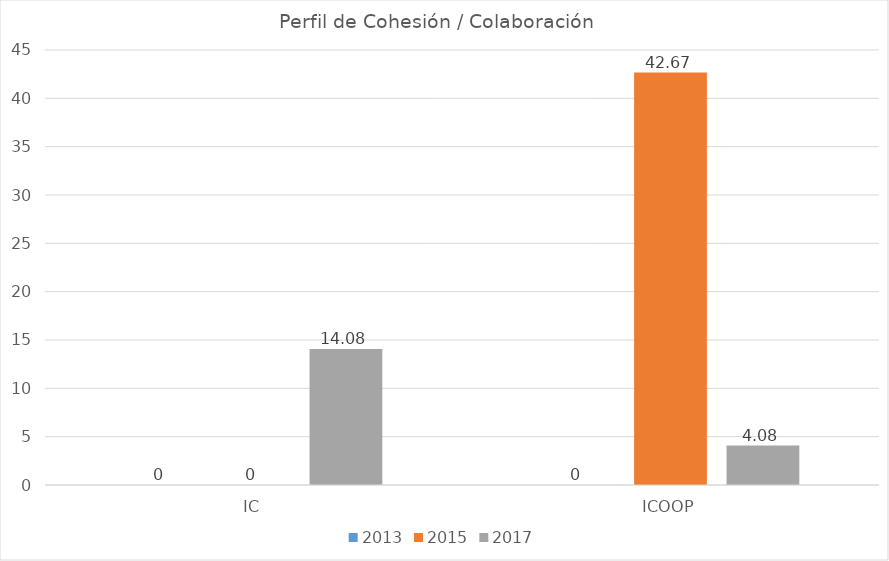
| Category | 2013 | 2015 | 2017 |
|---|---|---|---|
| IC | 0 | 0 | 14.08 |
| ICOOP | 0 | 42.67 | 4.08 |